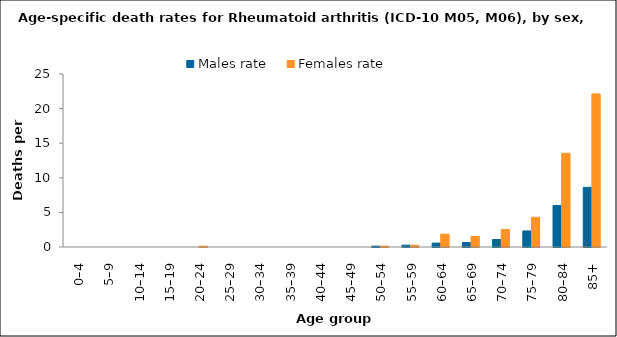
| Category | Males rate | Females rate |
|---|---|---|
| 0–4 | 0 | 0 |
| 5–9 | 0 | 0 |
| 10–14 | 0 | 0 |
| 15–19 | 0 | 0 |
| 20–24 | 0 | 0.127 |
| 25–29 | 0 | 0 |
| 30–34 | 0 | 0 |
| 35–39 | 0 | 0 |
| 40–44 | 0 | 0 |
| 45–49 | 0 | 0 |
| 50–54 | 0.126 | 0.122 |
| 55–59 | 0.262 | 0.254 |
| 60–64 | 0.562 | 1.857 |
| 65–69 | 0.648 | 1.509 |
| 70–74 | 1.082 | 2.533 |
| 75–79 | 2.321 | 4.292 |
| 80–84 | 6.001 | 13.539 |
| 85+ | 8.62 | 22.124 |